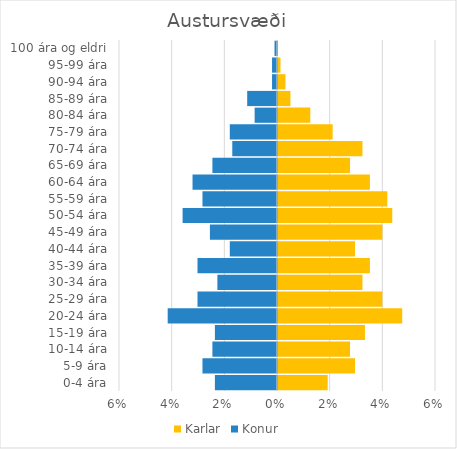
| Category | Karlar | Konur |
|---|---|---|
| 0-4 ára | 0.019 | -0.024 |
| 5-9 ára | 0.029 | -0.028 |
| 10-14 ára | 0.027 | -0.025 |
| 15-19 ára | 0.033 | -0.024 |
| 20-24 ára | 0.047 | -0.042 |
| 25-29 ára | 0.04 | -0.03 |
| 30-34 ára | 0.032 | -0.023 |
| 35-39 ára | 0.035 | -0.03 |
| 40-44 ára | 0.029 | -0.018 |
| 45-49 ára | 0.04 | -0.025 |
| 50-54 ára | 0.043 | -0.036 |
| 55-59 ára | 0.042 | -0.028 |
| 60-64 ára | 0.035 | -0.032 |
| 65-69 ára | 0.027 | -0.025 |
| 70-74 ára | 0.032 | -0.017 |
| 75-79 ára | 0.021 | -0.018 |
| 80-84 ára | 0.012 | -0.008 |
| 85-89 ára | 0.005 | -0.011 |
| 90-94 ára | 0.003 | -0.002 |
| 95-99 ára | 0.001 | -0.002 |
| 100 ára og eldri | 0 | -0.001 |